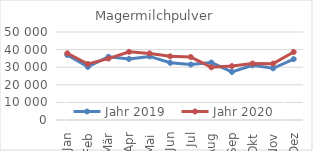
| Category | Jahr 2019 | Jahr 2020 |
|---|---|---|
| Jan | 36895.374 | 37904.802 |
| Feb | 30164.182 | 31828.101 |
| Mär | 35943.562 | 34899.397 |
| Apr | 34681.542 | 38728.48 |
| Mai | 36116.479 | 37843.723 |
| Jun | 32506.305 | 36185.623 |
| Jul | 31511.896 | 35769.785 |
| Aug | 32656.793 | 29925.526 |
| Sep | 27311.24 | 30650.693 |
| Okt | 31046.562 | 32097.364 |
| Nov | 29365.427 | 32029.814 |
| Dez | 34590.781 | 38648.137 |